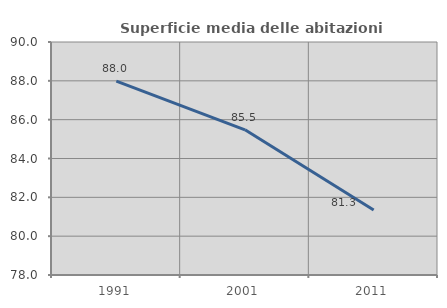
| Category | Superficie media delle abitazioni occupate |
|---|---|
| 1991.0 | 87.986 |
| 2001.0 | 85.476 |
| 2011.0 | 81.346 |